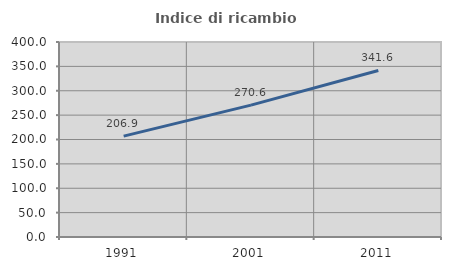
| Category | Indice di ricambio occupazionale  |
|---|---|
| 1991.0 | 206.901 |
| 2001.0 | 270.577 |
| 2011.0 | 341.576 |